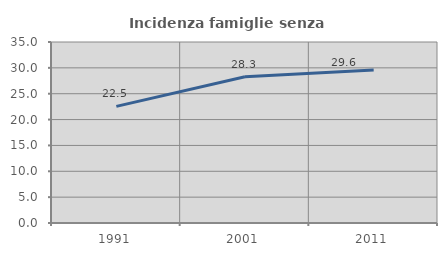
| Category | Incidenza famiglie senza nuclei |
|---|---|
| 1991.0 | 22.549 |
| 2001.0 | 28.278 |
| 2011.0 | 29.592 |